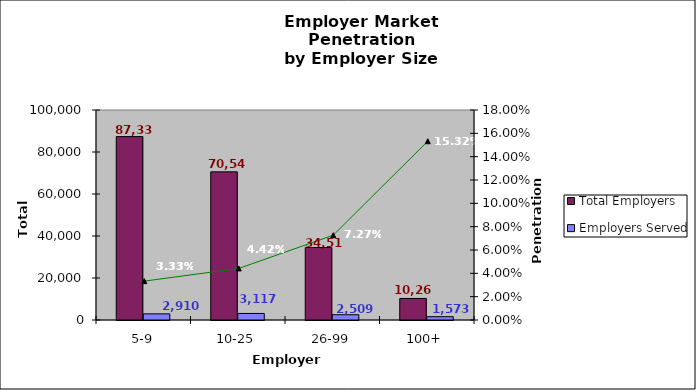
| Category | Total Employers | Employers Served |
|---|---|---|
| 5-9 | 87335 | 2910 |
| 10-25 | 70545 | 3117 |
| 26-99 | 34515 | 2509 |
| 100+ | 10265 | 1573 |